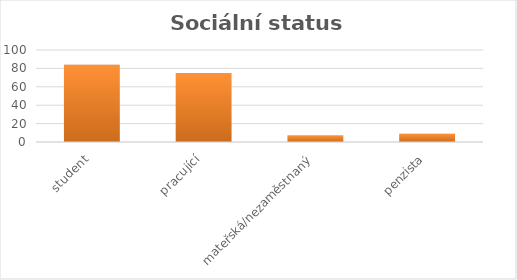
| Category | Sociální složení respondentů |
|---|---|
| student | 84 |
| pracující | 75 |
| mateřská/nezaměstnaný | 7 |
| penzista | 9 |